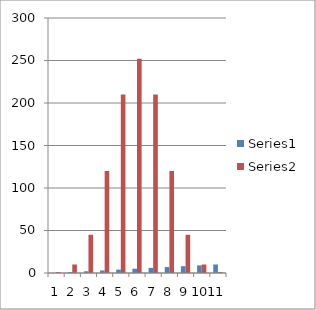
| Category | Series 0 | Series 1 |
|---|---|---|
| 0 | 0 | 1 |
| 1 | 1 | 10 |
| 2 | 2 | 45 |
| 3 | 3 | 120 |
| 4 | 4 | 210 |
| 5 | 5 | 252 |
| 6 | 6 | 210 |
| 7 | 7 | 120 |
| 8 | 8 | 45 |
| 9 | 9 | 10 |
| 10 | 10 | 1 |